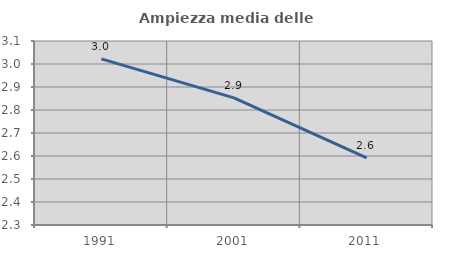
| Category | Ampiezza media delle famiglie |
|---|---|
| 1991.0 | 3.022 |
| 2001.0 | 2.853 |
| 2011.0 | 2.591 |